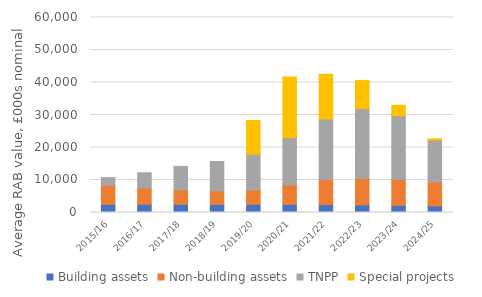
| Category | Building assets | Non-building assets | TNPP | Special projects |
|---|---|---|---|---|
| 2015/16 | 2494.159 | 5810.024 | 2430.198 | 0 |
| 2016/17 | 2531.146 | 4944.596 | 4751.321 | 0 |
| 2017/18 | 2515.582 | 4481.42 | 7193.164 | 0 |
| 2018/19 | 2491.114 | 4171.012 | 9033.82 | 0 |
| 2019/20 | 2500.993 | 4372.548 | 11043.689 | 10395.256 |
| 2020/21 | 2510.443 | 5949.724 | 14605.568 | 18652.262 |
| 2021/22 | 2434.549 | 7681.873 | 18652.025 | 13770.681 |
| 2022/23 | 2332.907 | 8162.666 | 21480.058 | 8614.326 |
| 2023/24 | 2204.902 | 7973.331 | 19594.604 | 3191.719 |
| 2024/25 | 2070.398 | 7302.958 | 12918.058 | 370.038 |